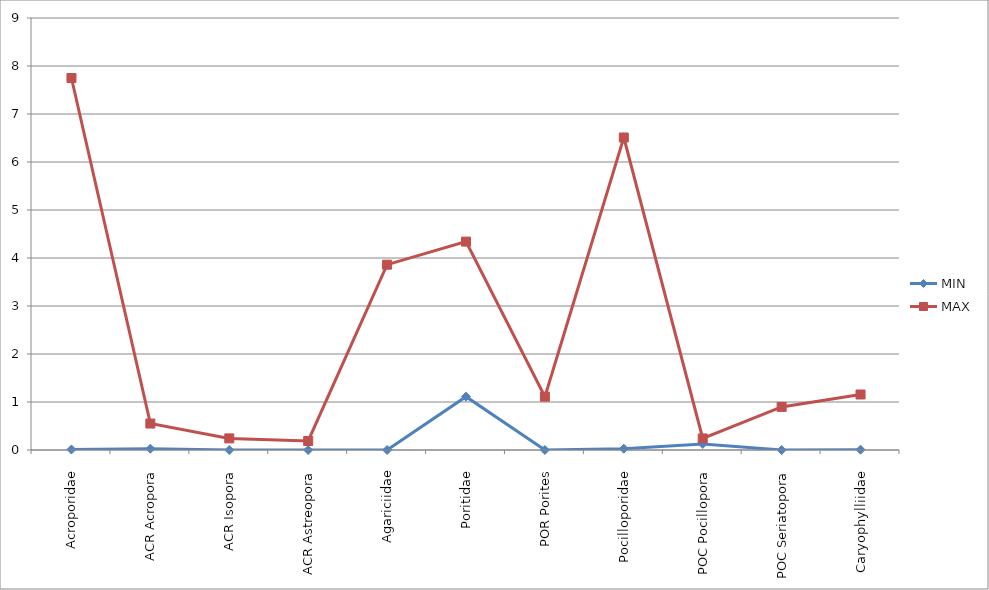
| Category | MIN | MAX |
|---|---|---|
| _x000c_Acroporidae  | 0.011 | 7.751 |
| _x000d_ACR Acropora  | 0.027 | 0.551 |
| _x000c_ACR Isopora  | 0 | 0.242 |
| _x000F_ACR Astreopora  | 0 | 0.188 |
| _x000c_Agariciidae  | 0 | 3.861 |
| 
Poritidae  | 1.111 | 4.341 |
| _x000c_POR Porites  | 0 | 1.111 |
| _x000F_Pocilloporidae  | 0.027 | 6.51 |
| _x0010_POC Pocillopora  | 0.126 | 0.241 |
| _x0010_POC Seriatopora  | 0 | 0.898 |
| _x0010_Caryophylliidae  | 0.006 | 1.157 |